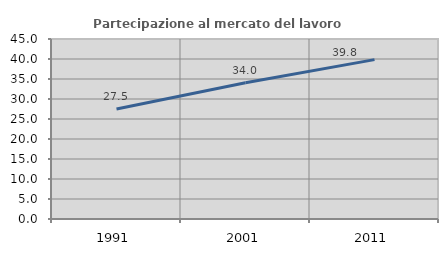
| Category | Partecipazione al mercato del lavoro  femminile |
|---|---|
| 1991.0 | 27.517 |
| 2001.0 | 34.043 |
| 2011.0 | 39.85 |